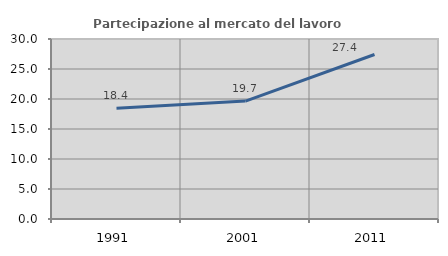
| Category | Partecipazione al mercato del lavoro  femminile |
|---|---|
| 1991.0 | 18.438 |
| 2001.0 | 19.651 |
| 2011.0 | 27.412 |